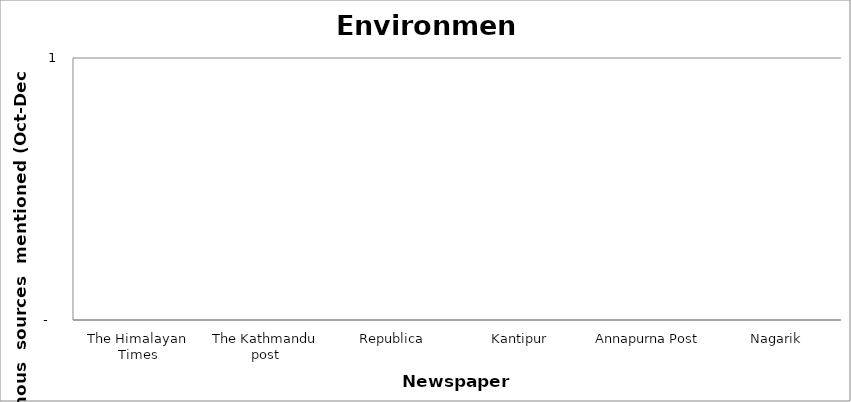
| Category | Environment |
|---|---|
| The Himalayan Times | 0 |
| The Kathmandu post | 0 |
| Republica | 0 |
| Kantipur | 0 |
| Annapurna Post | 0 |
| Nagarik | 0 |